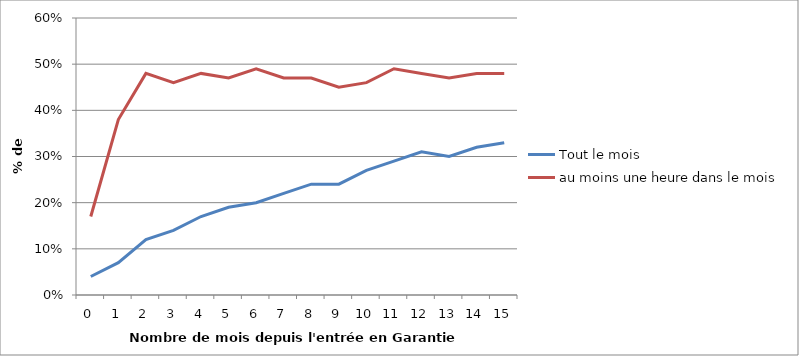
| Category | Tout le mois | au moins une heure dans le mois |
|---|---|---|
| 0.0 | 0.04 | 0.17 |
| 1.0 | 0.07 | 0.38 |
| 2.0 | 0.12 | 0.48 |
| 3.0 | 0.14 | 0.46 |
| 4.0 | 0.17 | 0.48 |
| 5.0 | 0.19 | 0.47 |
| 6.0 | 0.2 | 0.49 |
| 7.0 | 0.22 | 0.47 |
| 8.0 | 0.24 | 0.47 |
| 9.0 | 0.24 | 0.45 |
| 10.0 | 0.27 | 0.46 |
| 11.0 | 0.29 | 0.49 |
| 12.0 | 0.31 | 0.48 |
| 13.0 | 0.3 | 0.47 |
| 14.0 | 0.32 | 0.48 |
| 15.0 | 0.33 | 0.48 |